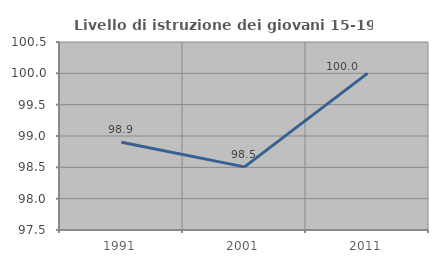
| Category | Livello di istruzione dei giovani 15-19 anni |
|---|---|
| 1991.0 | 98.901 |
| 2001.0 | 98.507 |
| 2011.0 | 100 |